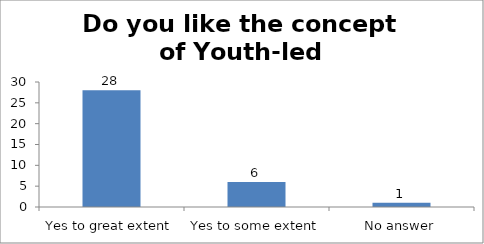
| Category | Do you like the concept of Youth-led Changemaking?  |
|---|---|
| Yes to great extent | 28 |
| Yes to some extent | 6 |
| No answer | 1 |